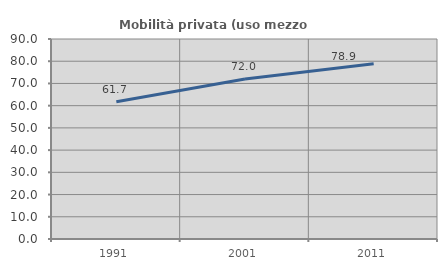
| Category | Mobilità privata (uso mezzo privato) |
|---|---|
| 1991.0 | 61.742 |
| 2001.0 | 71.977 |
| 2011.0 | 78.908 |